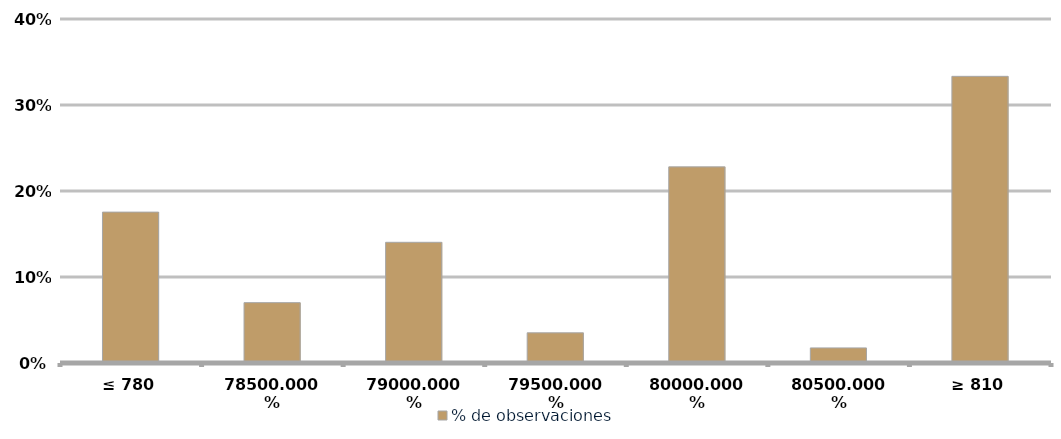
| Category | % de observaciones  |
|---|---|
| ≤ 780 | 0.175 |
| 785 | 0.07 |
| 790 | 0.14 |
| 795 | 0.035 |
| 800 | 0.228 |
| 805 | 0.018 |
| ≥ 810 | 0.333 |